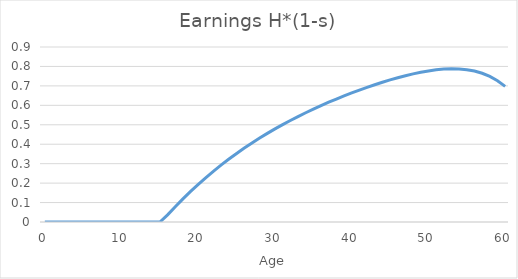
| Category | Earnings H*(1-s) |
|---|---|
| 0.0 | 0 |
| 1.0 | 0 |
| 2.0 | 0 |
| 3.0 | 0 |
| 4.0 | 0 |
| 5.0 | 0 |
| 6.0 | 0 |
| 7.0 | 0 |
| 8.0 | 0 |
| 9.0 | 0 |
| 10.0 | 0 |
| 11.0 | 0 |
| 12.0 | 0 |
| 13.0 | 0 |
| 14.0 | 0 |
| 15.0 | 0 |
| 16.0 | 0.037 |
| 17.0 | 0.079 |
| 18.0 | 0.119 |
| 19.0 | 0.157 |
| 20.0 | 0.194 |
| 21.0 | 0.229 |
| 22.0 | 0.262 |
| 23.0 | 0.294 |
| 24.0 | 0.324 |
| 25.0 | 0.353 |
| 26.0 | 0.38 |
| 27.0 | 0.406 |
| 28.0 | 0.432 |
| 29.0 | 0.456 |
| 30.0 | 0.479 |
| 31.0 | 0.501 |
| 32.0 | 0.522 |
| 33.0 | 0.542 |
| 34.0 | 0.562 |
| 35.0 | 0.581 |
| 36.0 | 0.599 |
| 37.0 | 0.616 |
| 38.0 | 0.633 |
| 39.0 | 0.648 |
| 40.0 | 0.664 |
| 41.0 | 0.679 |
| 42.0 | 0.693 |
| 43.0 | 0.706 |
| 44.0 | 0.719 |
| 45.0 | 0.731 |
| 46.0 | 0.742 |
| 47.0 | 0.752 |
| 48.0 | 0.762 |
| 49.0 | 0.77 |
| 50.0 | 0.777 |
| 51.0 | 0.783 |
| 52.0 | 0.786 |
| 53.0 | 0.788 |
| 54.0 | 0.787 |
| 55.0 | 0.783 |
| 56.0 | 0.776 |
| 57.0 | 0.765 |
| 58.0 | 0.749 |
| 59.0 | 0.727 |
| 60.0 | 0.697 |